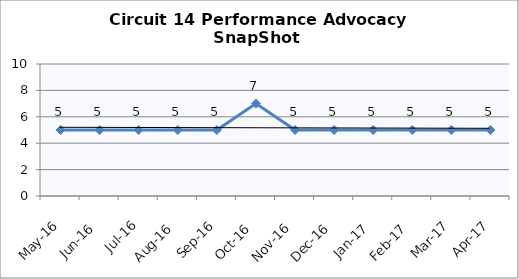
| Category | Circuit 14 |
|---|---|
| May-16 | 5 |
| Jun-16 | 5 |
| Jul-16 | 5 |
| Aug-16 | 5 |
| Sep-16 | 5 |
| Oct-16 | 7 |
| Nov-16 | 5 |
| Dec-16 | 5 |
| Jan-17 | 5 |
| Feb-17 | 5 |
| Mar-17 | 5 |
| Apr-17 | 5 |